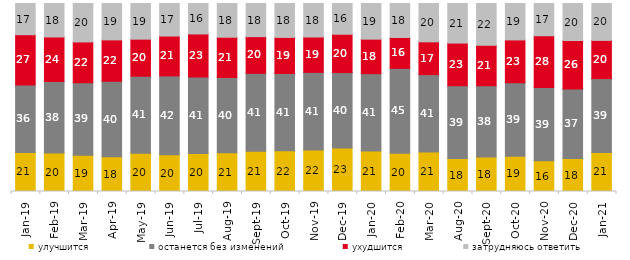
| Category | улучшится | останется без изменений | ухудшится | затрудняюсь ответить |
|---|---|---|---|---|
| 2019-01-01 | 20.75 | 35.95 | 26.7 | 16.6 |
| 2019-02-01 | 20.45 | 38.05 | 23.7 | 17.8 |
| 2019-03-01 | 19.344 | 38.538 | 21.681 | 20.438 |
| 2019-04-01 | 18.465 | 40.149 | 22.03 | 19.356 |
| 2019-05-01 | 20.406 | 40.911 | 19.713 | 18.97 |
| 2019-06-01 | 19.601 | 41.895 | 21.197 | 17.307 |
| 2019-07-01 | 20.149 | 40.743 | 22.921 | 16.188 |
| 2019-08-01 | 20.579 | 40.06 | 21.429 | 17.932 |
| 2019-09-01 | 21.386 | 41.485 | 19.505 | 17.624 |
| 2019-10-01 | 21.683 | 41.089 | 19.208 | 18.02 |
| 2019-11-01 | 22.03 | 41.337 | 18.812 | 17.822 |
| 2019-12-01 | 23.168 | 40.099 | 20.396 | 16.337 |
| 2020-01-01 | 21.485 | 41.188 | 18.366 | 18.96 |
| 2020-02-01 | 20.297 | 45.198 | 16.436 | 18.069 |
| 2020-03-01 | 21.071 | 41.101 | 17.452 | 20.377 |
| 2020-08-01 | 17.527 | 38.679 | 22.741 | 21.053 |
| 2020-09-01 | 18.318 | 37.979 | 21.453 | 22.25 |
| 2020-10-01 | 18.734 | 39.063 | 22.82 | 19.382 |
| 2020-11-01 | 16.35 | 38.95 | 27.55 | 17.15 |
| 2020-12-01 | 17.551 | 37.035 | 25.731 | 19.683 |
| 2021-01-01 | 20.765 | 39.295 | 20.318 | 19.622 |